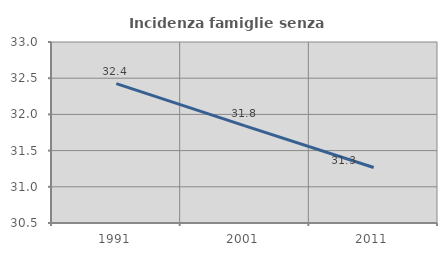
| Category | Incidenza famiglie senza nuclei |
|---|---|
| 1991.0 | 32.426 |
| 2001.0 | 31.841 |
| 2011.0 | 31.266 |